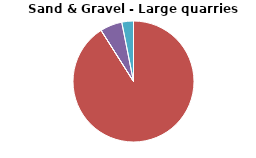
| Category | Series 0 |
|---|---|
| DRILLING AND BLASTING | 0 |
| MATERIAL PROCESSING | 14.52 |
| INTERNAL TRANSPORT | 0 |
| MATERIAL HANDLING OPERATION | 0.937 |
| WIND EROSION FROM STOCKPILES | 0.499 |